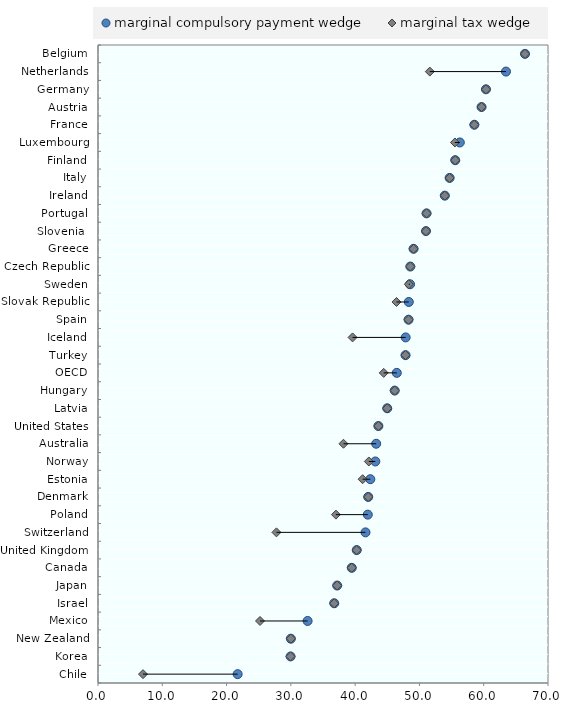
| Category | blankName |
|---|---|
| Chile | 7 |
| Korea | 29.955 |
| New Zealand | 30 |
| Mexico | 25.203 |
| Israel | 36.744 |
| Japan | 37.205 |
| Canada | 39.473 |
| United Kingdom | 40.246 |
| Switzerland | 27.758 |
| Poland | 37.013 |
| Denmark | 42.034 |
| Estonia | 41.166 |
| Norway | 42.133 |
| Australia | 38.189 |
| United States | 43.614 |
| Latvia | 44.989 |
| Hungary | 46.154 |
| OECD | 44.444 |
| Turkey | 47.837 |
| Iceland | 39.6 |
| Spain | 48.309 |
| Slovak Republic | 46.433 |
| Sweden | 48.349 |
| Czech Republic | 48.582 |
| Greece | 49.087 |
| Slovenia  | 51.019 |
| Portugal | 51.111 |
| Ireland | 53.95 |
| Italy | 54.697 |
| Finland | 55.568 |
| Luxembourg | 55.525 |
| France | 58.542 |
| Austria | 59.664 |
| Germany | 60.352 |
| Netherlands | 51.617 |
| Belgium | 66.421 |